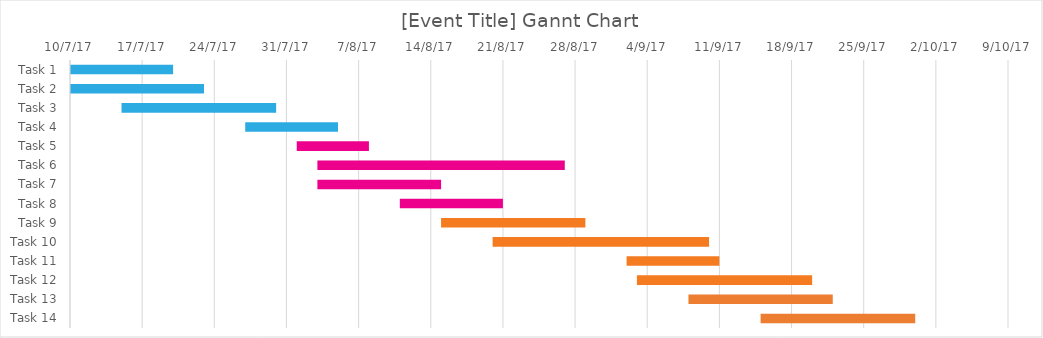
| Category | Start | Duration |
|---|---|---|
| Task 1 | 7/10/17 | 10 |
| Task 2 | 7/10/17 | 13 |
| Task 3 | 7/15/17 | 15 |
| Task 4 | 7/27/17 | 9 |
| Task 5 | 8/1/17 | 7 |
| Task 6 | 8/3/17 | 24 |
| Task 7 | 8/3/17 | 12 |
| Task 8 | 8/11/17 | 10 |
| Task 9 | 8/15/17 | 14 |
| Task 10 | 8/20/17 | 21 |
| Task 11 | 9/2/17 | 9 |
| Task 12 | 9/3/17 | 17 |
| Task 13 | 9/8/17 | 14 |
| Task 14 | 9/15/17 | 15 |